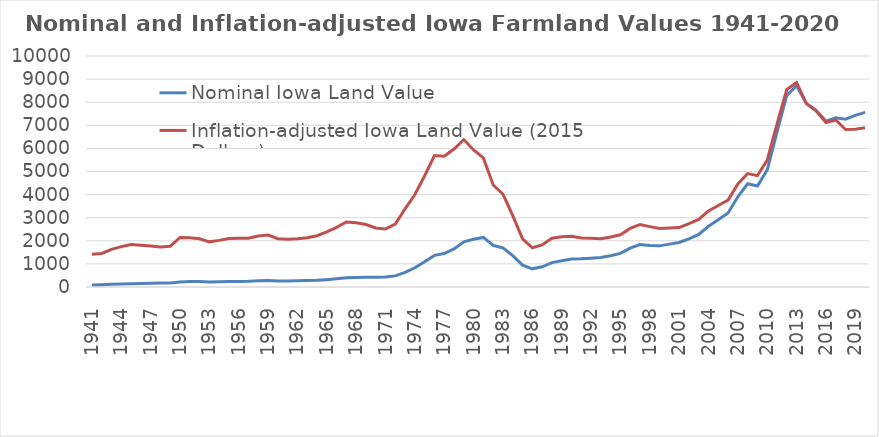
| Category | Nominal Iowa Land Value | Inflation-adjusted Iowa Land Value (2015 Dollars) |
|---|---|---|
| 1941.0 | 88 | 1416.381 |
| 1942.0 | 100 | 1451.534 |
| 1943.0 | 119 | 1627.48 |
| 1944.0 | 130 | 1747.614 |
| 1945.0 | 140 | 1840.222 |
| 1946.0 | 149 | 1807.867 |
| 1947.0 | 167 | 1771.848 |
| 1948.0 | 176 | 1735.067 |
| 1949.0 | 177 | 1759.588 |
| 1950.0 | 218 | 2144.1 |
| 1951.0 | 234 | 2133.3 |
| 1952.0 | 234 | 2085.2 |
| 1953.0 | 221 | 1954.6 |
| 1954.0 | 229 | 2017.9 |
| 1955.0 | 238 | 2102.4 |
| 1956.0 | 243 | 2115 |
| 1957.0 | 251 | 2114.8 |
| 1958.0 | 269 | 2206.3 |
| 1959.0 | 277 | 2248.6 |
| 1960.0 | 261 | 2087.7 |
| 1961.0 | 261 | 2066.8 |
| 1962.0 | 267 | 2088.7 |
| 1963.0 | 276 | 2133.3 |
| 1964.0 | 291 | 2220.3 |
| 1965.0 | 318 | 2387.9 |
| 1966.0 | 354 | 2581.8 |
| 1967.0 | 397 | 2817.4 |
| 1968.0 | 409 | 2783.2 |
| 1969.0 | 419 | 2703.7 |
| 1970.0 | 419 | 2553.1 |
| 1971.0 | 430 | 2512.5 |
| 1972.0 | 482 | 2726.7 |
| 1973.0 | 635 | 3384.9 |
| 1974.0 | 834 | 4001.7 |
| 1975.0 | 1095 | 4815.4 |
| 1976.0 | 1368 | 5688.8 |
| 1977.0 | 1450 | 5662.3 |
| 1978.0 | 1646 | 5971.8 |
| 1979.0 | 1958 | 6383.9 |
| 1980.0 | 2066 | 5933.5 |
| 1981.0 | 2147 | 5588.3 |
| 1982.0 | 1801 | 4416.2 |
| 1983.0 | 1691 | 4017.6 |
| 1984.0 | 1357 | 3090.9 |
| 1985.0 | 948 | 2085.8 |
| 1986.0 | 787 | 1699 |
| 1987.0 | 875 | 1822.5 |
| 1988.0 | 1054 | 2108.9 |
| 1989.0 | 1139 | 2174.3 |
| 1990.0 | 1214 | 2198.9 |
| 1991.0 | 1219 | 2117.8 |
| 1992.0 | 1249 | 2106.2 |
| 1993.0 | 1275 | 2088.6 |
| 1994.0 | 1356 | 2164.9 |
| 1995.0 | 1455 | 2259.6 |
| 1996.0 | 1682 | 2537.8 |
| 1997.0 | 1837 | 2707.9 |
| 1998.0 | 1801 | 2614.7 |
| 1999.0 | 1781 | 2529.9 |
| 2000.0 | 1857 | 2551.7 |
| 2001.0 | 1926 | 2573.9 |
| 2002.0 | 2083 | 2740.5 |
| 2003.0 | 2275 | 2926.5 |
| 2004.0 | 2629 | 3293.7 |
| 2005.0 | 2914 | 3530.7 |
| 2006.0 | 3204 | 3760.9 |
| 2007.0 | 3908 | 4459.9 |
| 2008.0 | 4468 | 4910.7 |
| 2009.0 | 4371 | 4821.2 |
| 2010.0 | 5064 | 5495.2 |
| 2011.0 | 6708 | 7056.3 |
| 2012.0 | 8296 | 8550.9 |
| 2013.0 | 8715.859 | 8854.1 |
| 2014.0 | 7942.957 | 7939.6 |
| 2015.0 | 7632.831 | 7632.8 |
| 2016.0 | 7183.344 | 7118 |
| 2017.0 | 7326 | 7228 |
| 2018.0 | 7264 | 6814.044 |
| 2019.0 | 7432 | 6831.2 |
| 2020.0 | 7559 | 6889.806 |